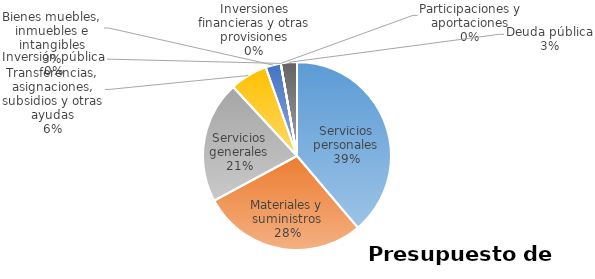
| Category | Series 0 | Series 1 | Series 2 | Series 3 | Series 4 | Series 5 |
|---|---|---|---|---|---|---|
| Servicios personales | 29027345.69 |  |  |  |  |  |
| Materiales y suministros | 21195071.9 |  |  |  |  |  |
| Servicios generales | 15695755 |  |  |  |  |  |
| Transferencias, asignaciones, subsidios y otras ayudas | 4848913 |  |  |  |  |  |
| Bienes muebles, inmuebles e intangibles | 1962663 |  |  |  |  |  |
| Inversión pública | 0 |  |  |  |  |  |
| Inversiones financieras y otras provisiones | 0 |  |  |  |  |  |
| Participaciones y aportaciones | 0 |  |  |  |  |  |
| Deuda pública | 2076000 |  |  |  |  |  |